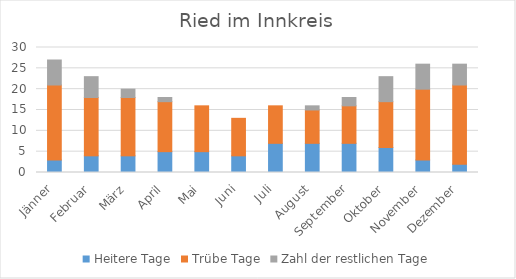
| Category | Heitere Tage | Trübe Tage | Zahl der restlichen Tage |
|---|---|---|---|
| Jänner | 3 | 18 | 6 |
| Februar | 4 | 14 | 5 |
| März | 4 | 14 | 2 |
| April | 5 | 12 | 1 |
| Mai | 5 | 11 | 0 |
| Juni | 4 | 9 | 0 |
| Juli | 7 | 9 | 0 |
| August | 7 | 8 | 1 |
| September | 7 | 9 | 2 |
| Oktober | 6 | 11 | 6 |
| November | 3 | 17 | 6 |
| Dezember | 2 | 19 | 5 |